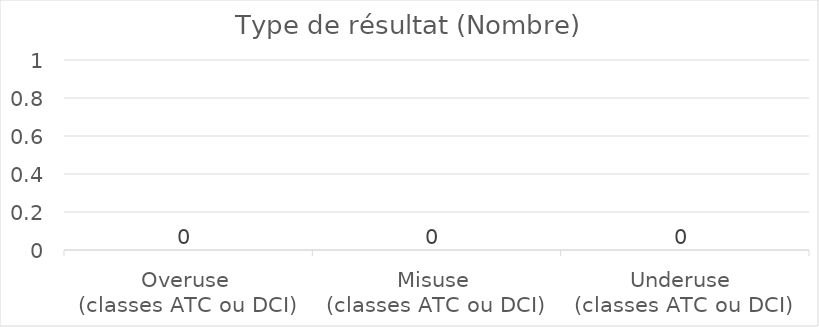
| Category | Series 0 |
|---|---|
| Overuse 
(classes ATC ou DCI) | 0 |
| Misuse 
(classes ATC ou DCI) | 0 |
| Underuse 
(classes ATC ou DCI) | 0 |